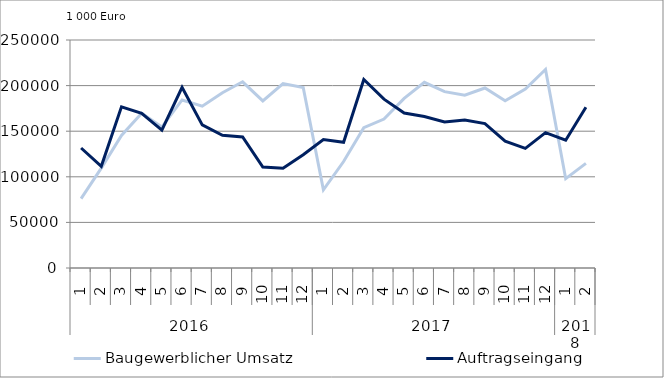
| Category | Baugewerblicher Umsatz | Auftragseingang |
|---|---|---|
| 0 | 76043.538 | 131571.482 |
| 1 | 109483.268 | 111467.248 |
| 2 | 145343.559 | 176673.268 |
| 3 | 169660.551 | 169566.96 |
| 4 | 154554.865 | 151228.165 |
| 5 | 184236.137 | 198035.655 |
| 6 | 177444.278 | 156900.898 |
| 7 | 192230.472 | 145537.167 |
| 8 | 204178.065 | 143616.217 |
| 9 | 183173.849 | 110770.94 |
| 10 | 202302.279 | 109384.188 |
| 11 | 197832.096 | 124193.91 |
| 12 | 85701.947 | 140751.008 |
| 13 | 116743.276 | 137863.383 |
| 14 | 153810.055 | 206710.579 |
| 15 | 163342.989 | 185183.797 |
| 16 | 185946.221 | 169878.51 |
| 17 | 203627.91 | 166148.392 |
| 18 | 193377.256 | 160134.206 |
| 19 | 189429.952 | 162221.206 |
| 20 | 197405.279 | 158305.285 |
| 21 | 183450.026 | 139156.761 |
| 22 | 196209.214 | 131165.419 |
| 23 | 217688.447 | 148434.901 |
| 24 | 97959.056 | 140119.385 |
| 25 | 114756.787 | 176330.213 |